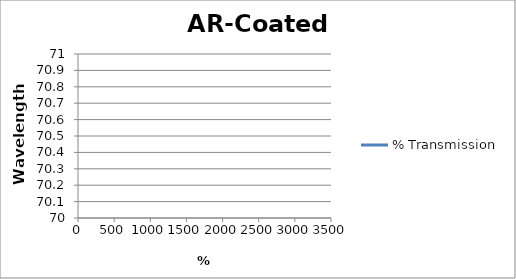
| Category | % Transmission |
|---|---|
| 0.2 | 0 |
| 0.201 | 0 |
| 0.202 | 0 |
| 0.203 | 0 |
| 0.204 | 0 |
| 0.205 | 0 |
| 0.206 | 0 |
| 0.207 | 0 |
| 0.208 | 0 |
| 0.209 | 0 |
| 0.21 | 0 |
| 0.211 | 0 |
| 0.212 | 0 |
| 0.213 | 0 |
| 0.214 | 0 |
| 0.215 | 0 |
| 0.216 | 0 |
| 0.217 | 0 |
| 0.218 | 0 |
| 0.219 | 0 |
| 0.22 | 0 |
| 0.221 | 0 |
| 0.222 | 0 |
| 0.223 | 0 |
| 0.224 | 0 |
| 0.225 | 0 |
| 0.226 | 0 |
| 0.227 | 0 |
| 0.228 | 0 |
| 0.229 | 0 |
| 0.23 | 0 |
| 0.231 | 0 |
| 0.232 | 0 |
| 0.233 | 0 |
| 0.234 | 0 |
| 0.235 | 0 |
| 0.236 | 0 |
| 0.237 | 0 |
| 0.238 | 0 |
| 0.239 | 0 |
| 0.24 | 0 |
| 0.241 | 0 |
| 0.242 | 0 |
| 0.243 | 0 |
| 0.244 | 0 |
| 0.245 | 0 |
| 0.246 | 0 |
| 0.247 | 0 |
| 0.248 | 0 |
| 0.249 | 0 |
| 0.25 | 0 |
| 0.251 | 0 |
| 0.252 | 0 |
| 0.253 | 0 |
| 0.254 | 0 |
| 0.255 | 0 |
| 0.256 | 0 |
| 0.257 | 0 |
| 0.258 | 0 |
| 0.259 | 0 |
| 0.26 | 0 |
| 0.261 | 0 |
| 0.262 | 0 |
| 0.263 | 0 |
| 0.264 | 0 |
| 0.265 | 0 |
| 0.266 | 0 |
| 0.267 | 0 |
| 0.268 | 0 |
| 0.269 | 0 |
| 0.27 | 0 |
| 0.271 | 0 |
| 0.272 | 0 |
| 0.273 | 0 |
| 0.274 | 0 |
| 0.275 | 0 |
| 0.276 | 0 |
| 0.277 | 0 |
| 0.278 | 0 |
| 0.279 | 0 |
| 0.28 | 0 |
| 0.281 | 0 |
| 0.282 | 0 |
| 0.283 | 0 |
| 0.284 | 0 |
| 0.285 | 0 |
| 0.286 | 0 |
| 0.287 | 0 |
| 0.288 | 0 |
| 0.289 | 0 |
| 0.29 | 0 |
| 0.291 | 0 |
| 0.292 | 0 |
| 0.293 | 0 |
| 0.294 | 0 |
| 0.295 | 0 |
| 0.296 | 0 |
| 0.297 | 0 |
| 0.298 | 0 |
| 0.299 | 0 |
| 0.3 | 0 |
| 0.301 | 0 |
| 0.302 | 0 |
| 0.303 | 0 |
| 0.304 | 0 |
| 0.305 | 0 |
| 0.306 | 0 |
| 0.307 | 0 |
| 0.308 | 0 |
| 0.309 | 0 |
| 0.31 | 0 |
| 0.311 | 0 |
| 0.312 | 0 |
| 0.313 | 0 |
| 0.314 | 0 |
| 0.315 | 0 |
| 0.316 | 0 |
| 0.317 | 0 |
| 0.318 | 0 |
| 0.319 | 0 |
| 0.32 | 0 |
| 0.321 | 0 |
| 0.322 | 0 |
| 0.323 | 0 |
| 0.324 | 0 |
| 0.325 | 0 |
| 0.326 | 0 |
| 0.327 | 0 |
| 0.328 | 0 |
| 0.329 | 0 |
| 0.33 | 0 |
| 0.331 | 0 |
| 0.332 | 0 |
| 0.333 | 0 |
| 0.334 | 0 |
| 0.335 | 0 |
| 0.336 | 0 |
| 0.337 | 0 |
| 0.338 | 0 |
| 0.339 | 0 |
| 0.34 | 0 |
| 0.341 | 0 |
| 0.342 | 0 |
| 0.343 | 0 |
| 0.344 | 0 |
| 0.345 | 0 |
| 0.346 | 0 |
| 0.347 | 0 |
| 0.348 | 0 |
| 0.349 | 0 |
| 0.35 | 0 |
| 0.351 | 0 |
| 0.352 | 0 |
| 0.353 | 0 |
| 0.354 | 0 |
| 0.355 | 0 |
| 0.356 | 0 |
| 0.357 | 0 |
| 0.358 | 0 |
| 0.359 | 0 |
| 0.36 | 0 |
| 0.361 | 0 |
| 0.362 | 0 |
| 0.363 | 0 |
| 0.364 | 0 |
| 0.365 | 0 |
| 0.366 | 0 |
| 0.367 | 0 |
| 0.368 | 0 |
| 0.369 | 0 |
| 0.37 | 0 |
| 0.371 | 0 |
| 0.372 | 0 |
| 0.373 | 0 |
| 0.374 | 0 |
| 0.375 | 0 |
| 0.376 | 0 |
| 0.377 | 0 |
| 0.378 | 0 |
| 0.379 | 0 |
| 0.38 | 0 |
| 0.381 | 0 |
| 0.382 | 0 |
| 0.383 | 0 |
| 0.384 | 0 |
| 0.385 | 0 |
| 0.386 | 0 |
| 0.387 | 0 |
| 0.388 | 0 |
| 0.389 | 0 |
| 0.39 | 0 |
| 0.391 | 0 |
| 0.392 | 0 |
| 0.393 | 0 |
| 0.394 | 0 |
| 0.395 | 0 |
| 0.396 | 0 |
| 0.397 | 0 |
| 0.398 | 0 |
| 0.399 | 0 |
| 0.4 | 0 |
| 0.401 | 0 |
| 0.402 | 0 |
| 0.403 | 0 |
| 0.404 | 0 |
| 0.405 | 0 |
| 0.406 | 0 |
| 0.407 | 0 |
| 0.408 | 0 |
| 0.409 | 0 |
| 0.41 | 0 |
| 0.411 | 0 |
| 0.412 | 0 |
| 0.413 | 0 |
| 0.414 | 0 |
| 0.415 | 0 |
| 0.416 | 0 |
| 0.417 | 0 |
| 0.418 | 0 |
| 0.419 | 0 |
| 0.42 | 0 |
| 0.421 | 0 |
| 0.422 | 0 |
| 0.423 | 0 |
| 0.424 | 0 |
| 0.425 | 0 |
| 0.426 | 0 |
| 0.427 | 0 |
| 0.428 | 0 |
| 0.429 | 0 |
| 0.43 | 0 |
| 0.431 | 0 |
| 0.432 | 0 |
| 0.433 | 0 |
| 0.434 | 0 |
| 0.435 | 0 |
| 0.436 | 0 |
| 0.437 | 0 |
| 0.438 | 0 |
| 0.439 | 0 |
| 0.44 | 0 |
| 0.441 | 0 |
| 0.442 | 0 |
| 0.443 | 0 |
| 0.444 | 0 |
| 0.445 | 0 |
| 0.446 | 0 |
| 0.447 | 0 |
| 0.448 | 0 |
| 0.449 | 0 |
| 0.45 | 0 |
| 0.451 | 0 |
| 0.452 | 0 |
| 0.453 | 0 |
| 0.454 | 0 |
| 0.455 | 0 |
| 0.456 | 0 |
| 0.457 | 0 |
| 0.458 | 0 |
| 0.459 | 0 |
| 0.46 | 0 |
| 0.461 | 0 |
| 0.462 | 0 |
| 0.463 | 0 |
| 0.464 | 0 |
| 0.465 | 0 |
| 0.466 | 0 |
| 0.467 | 0 |
| 0.468 | 0 |
| 0.469 | 0 |
| 0.47 | 0 |
| 0.471 | 0 |
| 0.472 | 0 |
| 0.473 | 0 |
| 0.474 | 0 |
| 0.475 | 0 |
| 0.476 | 0 |
| 0.477 | 0 |
| 0.478 | 0 |
| 0.479 | 0 |
| 0.48 | 0 |
| 0.481 | 0 |
| 0.482 | 0 |
| 0.483 | 0 |
| 0.484 | 0 |
| 0.485 | 0 |
| 0.486 | 0 |
| 0.487 | 0 |
| 0.488 | 0 |
| 0.489 | 0 |
| 0.49 | 0 |
| 0.491 | 0 |
| 0.492 | 0 |
| 0.493 | 0 |
| 0.494 | 0 |
| 0.495 | 0 |
| 0.496 | 0 |
| 0.497 | 0 |
| 0.498 | 0 |
| 0.499 | 0 |
| 0.5 | 0 |
| 0.501 | 0 |
| 0.502 | 0 |
| 0.503 | 0 |
| 0.504 | 0 |
| 0.505 | 0 |
| 0.506 | 0 |
| 0.507 | 0 |
| 0.508 | 0 |
| 0.509 | 0 |
| 0.51 | 0 |
| 0.511 | 0 |
| 0.512 | 0 |
| 0.513 | 0 |
| 0.514 | 0 |
| 0.515 | 0 |
| 0.516 | 0 |
| 0.517 | 0 |
| 0.518 | 0 |
| 0.519 | 0 |
| 0.52 | 0 |
| 0.521 | 0 |
| 0.522 | 0 |
| 0.523 | 0 |
| 0.524 | 0 |
| 0.525 | 0 |
| 0.526 | 0 |
| 0.527 | 0 |
| 0.528 | 0 |
| 0.529 | 0 |
| 0.53 | 0 |
| 0.531 | 0 |
| 0.532 | 0 |
| 0.533 | 0 |
| 0.534 | 0 |
| 0.535 | 0 |
| 0.536 | 0 |
| 0.537 | 0 |
| 0.538 | 0 |
| 0.539 | 0 |
| 0.54 | 0 |
| 0.541 | 0 |
| 0.542 | 0 |
| 0.543 | 0 |
| 0.544 | 0 |
| 0.545 | 0 |
| 0.546 | 0 |
| 0.547 | 0 |
| 0.548 | 0 |
| 0.549 | 0 |
| 0.55 | 0 |
| 0.551 | 0 |
| 0.552 | 0 |
| 0.553 | 0 |
| 0.554 | 0 |
| 0.555 | 0 |
| 0.556 | 0 |
| 0.557 | 0 |
| 0.558 | 0 |
| 0.559 | 0 |
| 0.56 | 0 |
| 0.561 | 0 |
| 0.562 | 0 |
| 0.563 | 0 |
| 0.564 | 0 |
| 0.565 | 0 |
| 0.566 | 0 |
| 0.567 | 0 |
| 0.568 | 0 |
| 0.569 | 0 |
| 0.57 | 0 |
| 0.571 | 0 |
| 0.572 | 0 |
| 0.573 | 0 |
| 0.574 | 0 |
| 0.575 | 0 |
| 0.576 | 0 |
| 0.577 | 0 |
| 0.578 | 0 |
| 0.579 | 0 |
| 0.58 | 0 |
| 0.581 | 0 |
| 0.582 | 0 |
| 0.583 | 0 |
| 0.584 | 0 |
| 0.585 | 0 |
| 0.586 | 0 |
| 0.587 | 0 |
| 0.588 | 0 |
| 0.589 | 0 |
| 0.59 | 0 |
| 0.591 | 0 |
| 0.592 | 0 |
| 0.593 | 0 |
| 0.594 | 0 |
| 0.595 | 0 |
| 0.596 | 0 |
| 0.597 | 0 |
| 0.598 | 0 |
| 0.599 | 0 |
| 0.6 | 0 |